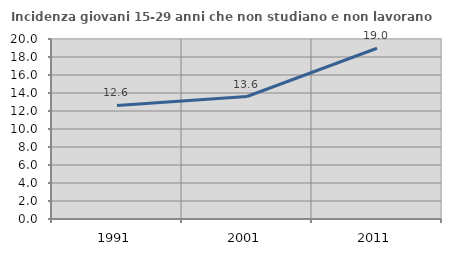
| Category | Incidenza giovani 15-29 anni che non studiano e non lavorano  |
|---|---|
| 1991.0 | 12.621 |
| 2001.0 | 13.609 |
| 2011.0 | 18.971 |